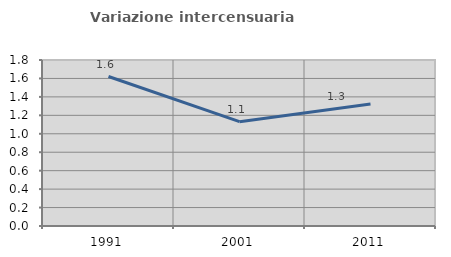
| Category | Variazione intercensuaria annua |
|---|---|
| 1991.0 | 1.621 |
| 2001.0 | 1.132 |
| 2011.0 | 1.323 |